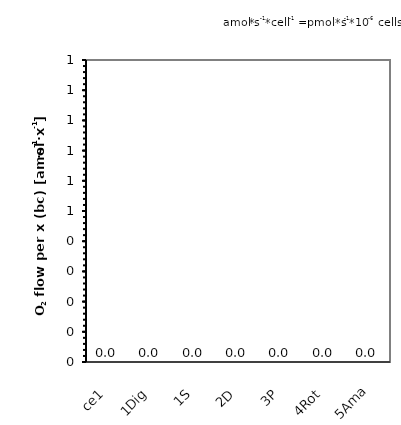
| Category | O2 flow per x (bc) |
|---|---|
| ce1 | 0 |
| 1Dig | 0 |
| 1S | 0 |
| 2D | 0 |
| 3P | 0 |
| 4Rot | 0 |
| 5Ama | 0 |